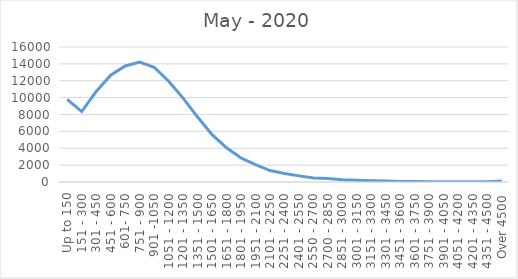
| Category | May - 2020 |
|---|---|
| Up to 150 | 9804 |
| 151 - 300 | 8343 |
| 301 - 450 | 10729 |
| 451 - 600 | 12651 |
| 601- 750 | 13749 |
| 751 - 900 | 14212 |
| 901 -1050 | 13602 |
| 1051 - 1200 | 11941 |
| 1201 - 1350 | 9941 |
| 1351 - 1500 | 7696 |
| 1501 - 1650 | 5604 |
| 1651 - 1800 | 4049 |
| 1801 - 1950 | 2841 |
| 1951 - 2100 | 2070 |
| 2101 - 2250 | 1352 |
| 2251 - 2400 | 1002 |
| 2401 - 2550 | 728 |
| 2550 - 2700 | 483 |
| 2700 - 2850 | 401 |
| 2851 - 3000 | 275 |
| 3001 - 3150 | 217 |
| 3151 - 3300 | 155 |
| 3301 - 3450 | 124 |
| 3451 - 3600 | 73 |
| 3601 - 3750 | 73 |
| 3751 - 3900 | 38 |
| 3901 - 4050 | 41 |
| 4051 - 4200 | 24 |
| 4201 - 4350 | 24 |
| 4351 - 4500 | 26 |
| Over 4500 | 133 |